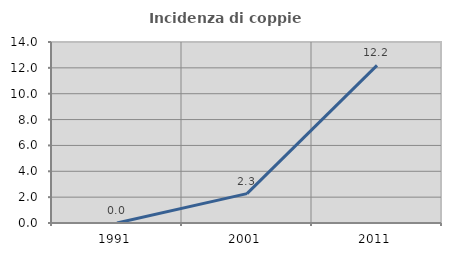
| Category | Incidenza di coppie miste |
|---|---|
| 1991.0 | 0 |
| 2001.0 | 2.273 |
| 2011.0 | 12.195 |